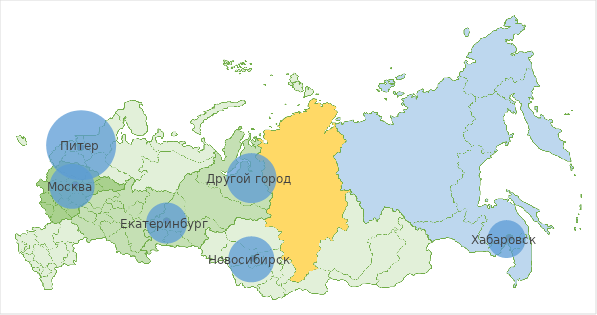
| Category | y |
|---|---|
| 25.0 | 10 |
| 6.0 | 28 |
| 7.0 | 38 |
| 52.0 | 15 |
| 16.0 | 19 |
| 25.0 | 30 |